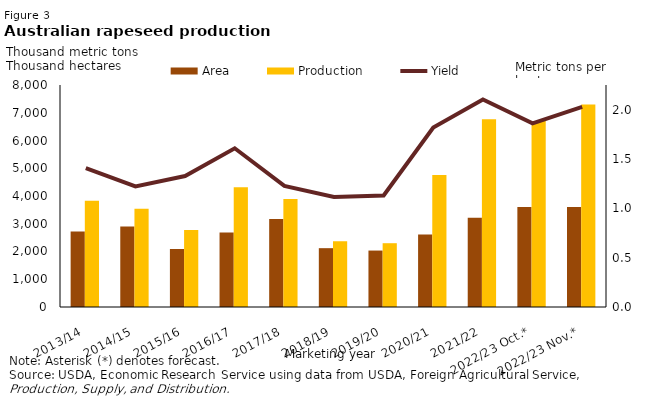
| Category | Area | Production |
|---|---|---|
| 2013/14 | 2721 | 3832 |
| 2014/15 | 2897 | 3540 |
| 2015/16 | 2091 | 2775 |
| 2016/17 | 2681 | 4313 |
| 2017/18 | 3171 | 3893 |
| 2018/19 | 2120 | 2366 |
| 2019/20 | 2034 | 2299 |
| 2020/21 | 2614 | 4756 |
| 2021/22 | 3215 | 6762 |
| 2022/23 Oct.* | 3600 | 6700 |
| 2022/23 Nov.* | 3600 | 7300 |